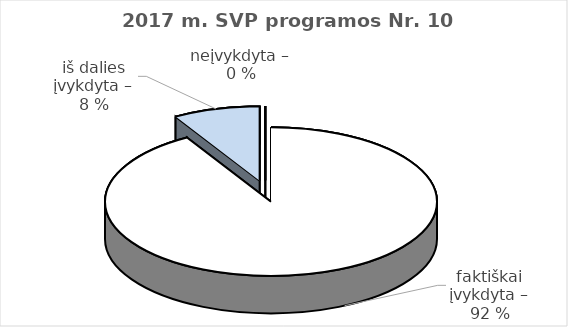
| Category | Series 0 |
|---|---|
| faktiškai įvykdyta – | 65 |
| iš dalies įvykdyta – | 6 |
| neįvykdyta – | 0 |